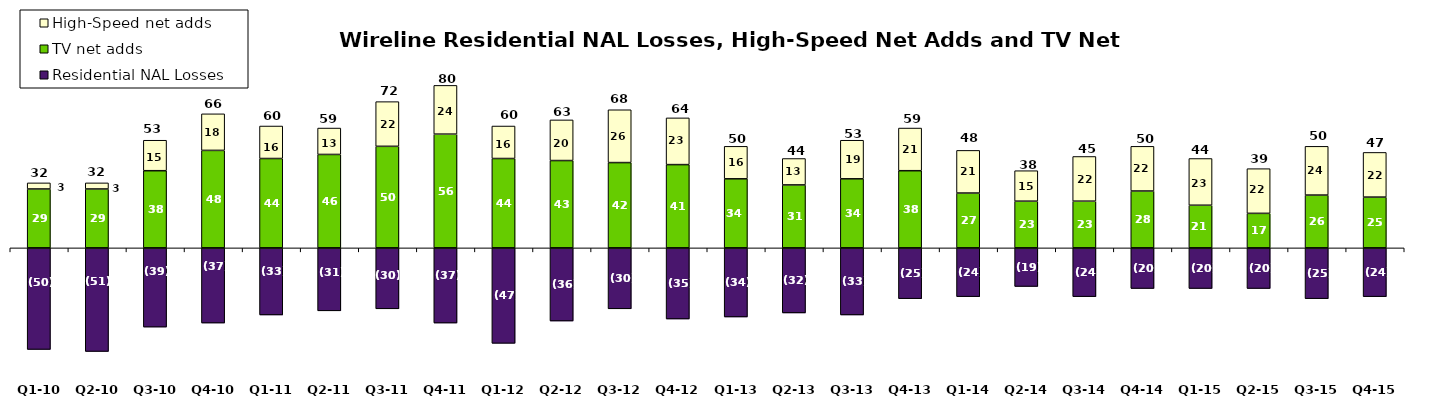
| Category | Residential NAL Losses | TV net adds | High-Speed net adds |
|---|---|---|---|
| Q1-10 | -50 | 29 | 3 |
| Q2-10 | -51 | 29 | 3 |
| Q3-10 | -39 | 38 | 15 |
| Q4-10 | -37 | 48 | 18 |
| Q1-11 | -33 | 44 | 16 |
| Q2-11 | -31 | 46 | 13 |
| Q3-11 | -30 | 50 | 22 |
| Q4-11 | -37 | 56 | 24 |
| Q1-12 | -47 | 44 | 16 |
| Q2-12 | -36 | 43 | 20 |
| Q3-12 | -30 | 42 | 26 |
| Q4-12 | -35 | 41 | 23 |
| Q1-13 | -34 | 34 | 16 |
| Q2-13 | -32 | 31 | 13 |
| Q3-13 | -33 | 34 | 19 |
| Q4-13 | -25 | 38 | 21 |
| Q1-14 | -24 | 27 | 21 |
| Q2-14 | -19 | 23 | 15 |
| Q3-14 | -24 | 23 | 22 |
| Q4-14 | -20 | 28 | 22 |
| Q1-15 | -20 | 21 | 23 |
| Q2-15 | -20 | 17 | 22 |
| Q3-15 | -25 | 26 | 24 |
| Q4-15 | -24 | 25 | 22 |